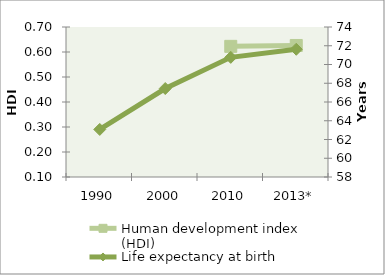
| Category | Human development index (HDI) |
|---|---|
| 1990 | 0 |
| 2000 | 0 |
| 2010 | 0.623 |
| 2013* | 0.626 |